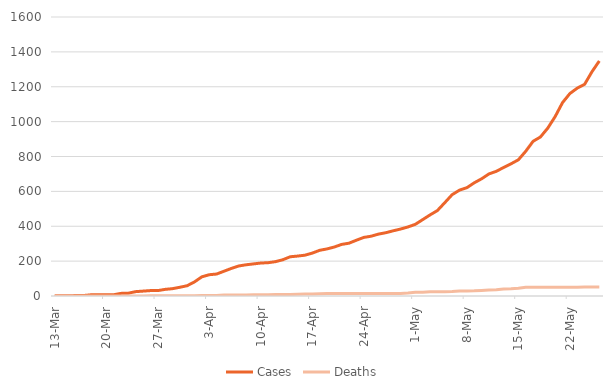
| Category | Cases | Deaths  |
|---|---|---|
| 2020-03-13 | 1 | 0 |
| 2020-03-14 | 1 | 0 |
| 2020-03-15 | 1 | 0 |
| 2020-03-16 | 3 | 0 |
| 2020-03-17 | 3 | 0 |
| 2020-03-18 | 7 | 0 |
| 2020-03-19 | 7 | 0 |
| 2020-03-20 | 7 | 0 |
| 2020-03-21 | 7 | 0 |
| 2020-03-22 | 15 | 0 |
| 2020-03-23 | 16 | 0 |
| 2020-03-24 | 25 | 0 |
| 2020-03-25 | 28 | 0 |
| 2020-03-26 | 31 | 1 |
| 2020-03-27 | 31 | 1 |
| 2020-03-28 | 38 | 1 |
| 2020-03-29 | 42 | 1 |
| 2020-03-30 | 50 | 1 |
| 2020-03-31 | 59 | 1 |
| 2020-04-01 | 81 | 1 |
| 2020-04-02 | 110 | 3 |
| 2020-04-03 | 122 | 3 |
| 2020-04-04 | 126 | 3 |
| 2020-04-05 | 142 | 6 |
| 2020-04-06 | 158 | 6 |
| 2020-04-07 | 172 | 6 |
| 2020-04-08 | 179 | 6 |
| 2020-04-09 | 184 | 7 |
| 2020-04-10 | 189 | 7 |
| 2020-04-11 | 191 | 7 |
| 2020-04-12 | 197 | 8 |
| 2020-04-13 | 208 | 9 |
| 2020-04-14 | 225 | 9 |
| 2020-04-15 | 229 | 10 |
| 2020-04-16 | 234 | 11 |
| 2020-04-17 | 246 | 11 |
| 2020-04-18 | 262 | 13 |
| 2020-04-19 | 270 | 14 |
| 2020-04-20 | 281 | 14 |
| 2020-04-21 | 296 | 14 |
| 2020-04-22 | 303 | 14 |
| 2020-04-23 | 320 | 14 |
| 2020-04-24 | 336 | 14 |
| 2020-04-25 | 343 | 14 |
| 2020-04-26 | 355 | 14 |
| 2020-04-27 | 363 | 14 |
| 2020-04-28 | 374 | 14 |
| 2020-04-29 | 384 | 15 |
| 2020-04-30 | 396 | 17 |
| 2020-05-01 | 411 | 21 |
| 2020-05-02 | 438 | 22 |
| 2020-05-03 | 465 | 24 |
| 2020-05-04 | 490 | 24 |
| 2020-05-05 | 535 | 24 |
| 2020-05-06 | 581 | 26 |
| 2020-05-07 | 607 | 29 |
| 2020-05-08 | 621 | 29 |
| 2020-05-09 | 649 | 30 |
| 2020-05-10 | 672 | 32 |
| 2020-05-11 | 700 | 34 |
| 2020-05-12 | 715 | 36 |
| 2020-05-13 | 737 | 40 |
| 2020-05-14 | 758 | 42 |
| 2020-05-15 | 781 | 45 |
| 2020-05-16 | 830 | 50 |
| 2020-05-17 | 887 | 50 |
| 2020-05-18 | 912 | 50 |
| 2020-05-19 | 963 | 50 |
| 2020-05-20 | 1029 | 50 |
| 2020-05-21 | 1109 | 50 |
| 2020-05-22 | 1161 | 50 |
| 2020-05-23 | 1192 | 50 |
| 2020-05-24 | 1214 | 51 |
| 2020-05-25 | 1286 | 52 |
| 2020-05-26 | 1348 | 52 |